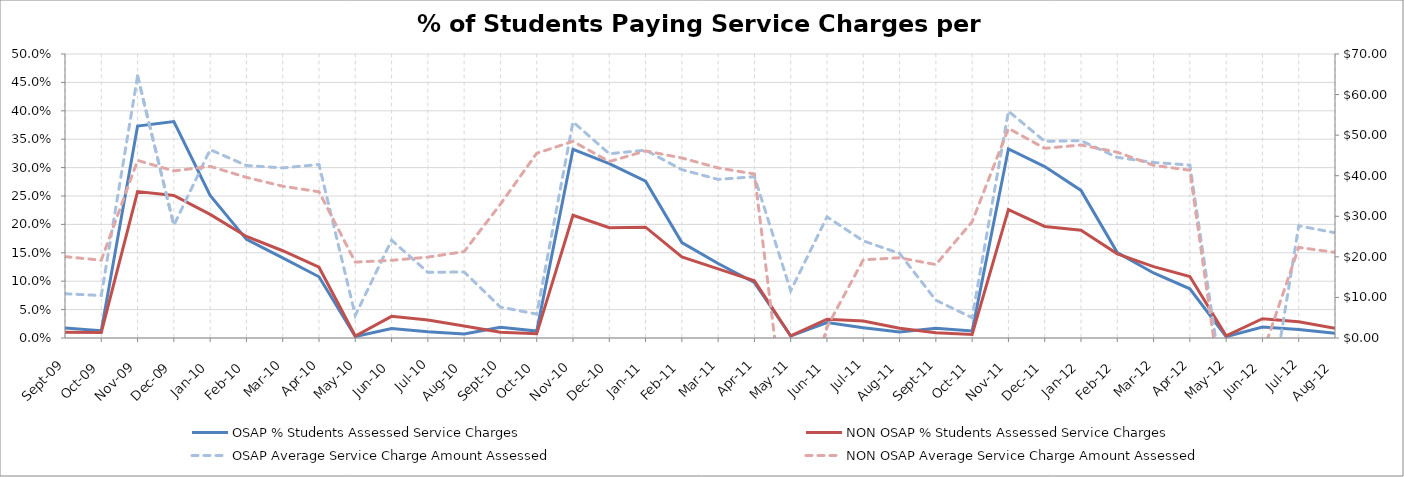
| Category | OSAP % Students Assessed Service Charges | NON OSAP % Students Assessed Service Charges |
|---|---|---|
| 2009-09-01 | 0.017 | 0.01 |
| 2009-10-01 | 0.013 | 0.01 |
| 2009-11-01 | 0.373 | 0.258 |
| 2009-12-01 | 0.381 | 0.251 |
| 2010-01-01 | 0.251 | 0.218 |
| 2010-02-01 | 0.174 | 0.179 |
| 2010-03-01 | 0.141 | 0.154 |
| 2010-04-01 | 0.108 | 0.125 |
| 2010-05-01 | 0.003 | 0.003 |
| 2010-06-01 | 0.017 | 0.038 |
| 2010-07-01 | 0.011 | 0.032 |
| 2010-08-01 | 0.007 | 0.021 |
| 2010-09-01 | 0.019 | 0.01 |
| 2010-10-01 | 0.012 | 0.007 |
| 2010-11-01 | 0.332 | 0.216 |
| 2010-12-01 | 0.307 | 0.194 |
| 2011-01-01 | 0.276 | 0.195 |
| 2011-02-01 | 0.168 | 0.143 |
| 2011-03-01 | 0.131 | 0.122 |
| 2011-04-01 | 0.098 | 0.101 |
| 2011-05-01 | 0.003 | 0.004 |
| 2011-06-01 | 0.027 | 0.033 |
| 2011-07-01 | 0.018 | 0.03 |
| 2011-08-01 | 0.011 | 0.017 |
| 2011-09-01 | 0.017 | 0.009 |
| 2011-10-01 | 0.012 | 0.006 |
| 2011-11-01 | 0.333 | 0.226 |
| 2011-12-01 | 0.302 | 0.196 |
| 2012-01-01 | 0.26 | 0.19 |
| 2012-02-01 | 0.15 | 0.148 |
| 2012-03-01 | 0.115 | 0.126 |
| 2012-04-01 | 0.087 | 0.108 |
| 2012-05-01 | 0.002 | 0.004 |
| 2012-06-01 | 0.019 | 0.034 |
| 2012-07-01 | 0.015 | 0.029 |
| 2012-08-01 | 0.008 | 0.017 |